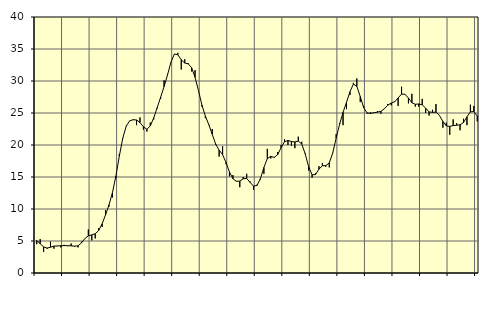
| Category | Piggar | Series 1 |
|---|---|---|
| nan | 4.5 | 5.07 |
| 87.0 | 5.3 | 4.58 |
| 87.0 | 3.3 | 4.08 |
| 87.0 | 3.8 | 3.89 |
| nan | 4.9 | 4.03 |
| 88.0 | 3.8 | 4.2 |
| 88.0 | 4.2 | 4.23 |
| 88.0 | 4 | 4.26 |
| nan | 4.4 | 4.28 |
| 89.0 | 4.2 | 4.27 |
| 89.0 | 4.6 | 4.25 |
| 89.0 | 4.1 | 4.19 |
| nan | 4 | 4.25 |
| 90.0 | 4.9 | 4.7 |
| 90.0 | 5.4 | 5.39 |
| 90.0 | 6.8 | 5.81 |
| nan | 5.1 | 5.95 |
| 91.0 | 5.4 | 6.14 |
| 91.0 | 7 | 6.64 |
| 91.0 | 7.2 | 7.68 |
| nan | 9.8 | 9.09 |
| 92.0 | 10.4 | 10.65 |
| 92.0 | 11.8 | 12.55 |
| 92.0 | 14.8 | 15.14 |
| nan | 18.6 | 18.26 |
| 93.0 | 21 | 21.06 |
| 93.0 | 23 | 22.94 |
| 93.0 | 23.8 | 23.77 |
| nan | 23.9 | 23.95 |
| 94.0 | 23.1 | 23.91 |
| 94.0 | 24.3 | 23.51 |
| 94.0 | 22.4 | 22.84 |
| nan | 22.1 | 22.46 |
| 95.0 | 23.5 | 22.98 |
| 95.0 | 24 | 24.25 |
| 95.0 | 25.7 | 25.82 |
| nan | 27.2 | 27.47 |
| 96.0 | 30.1 | 29.12 |
| 96.0 | 31.1 | 30.95 |
| 96.0 | 32.9 | 32.94 |
| nan | 34.2 | 34.22 |
| 97.0 | 34.4 | 34.1 |
| 97.0 | 31.8 | 33.31 |
| 97.0 | 33.4 | 32.81 |
| nan | 32.8 | 32.68 |
| 98.0 | 31.5 | 32.09 |
| 98.0 | 31.7 | 30.58 |
| 98.0 | 28.5 | 28.5 |
| nan | 26 | 26.23 |
| 99.0 | 24.2 | 24.52 |
| 99.0 | 23.1 | 23.18 |
| 99.0 | 22.5 | 21.67 |
| nan | 20 | 20.13 |
| 0.0 | 18.2 | 19.2 |
| 0.0 | 19.8 | 18.49 |
| 0.0 | 17 | 17.27 |
| nan | 15.1 | 15.78 |
| 1.0 | 15.3 | 14.73 |
| 1.0 | 14.3 | 14.33 |
| 1.0 | 13.4 | 14.36 |
| nan | 15 | 14.72 |
| 2.0 | 15.5 | 14.77 |
| 2.0 | 14.3 | 14.16 |
| 2.0 | 13 | 13.57 |
| nan | 13.8 | 13.69 |
| 3.0 | 14.6 | 14.76 |
| 3.0 | 15.5 | 16.48 |
| 3.0 | 19.4 | 17.88 |
| nan | 17.9 | 18.22 |
| 4.0 | 18 | 18.06 |
| 4.0 | 18.9 | 18.49 |
| 4.0 | 20 | 19.58 |
| nan | 20.9 | 20.52 |
| 5.0 | 20 | 20.71 |
| 5.0 | 19.9 | 20.55 |
| 5.0 | 19.5 | 20.48 |
| nan | 21.3 | 20.6 |
| 6.0 | 20.5 | 20.17 |
| 6.0 | 18.7 | 18.62 |
| 6.0 | 16 | 16.62 |
| nan | 14.9 | 15.34 |
| 7.0 | 15.6 | 15.38 |
| 7.0 | 16.7 | 16.23 |
| 7.0 | 17.2 | 16.75 |
| nan | 16.6 | 16.78 |
| 8.0 | 16.5 | 17.21 |
| 8.0 | 18.7 | 18.74 |
| 8.0 | 21.7 | 21.08 |
| nan | 23.4 | 23.23 |
| 9.0 | 23.1 | 25.1 |
| 9.0 | 25.6 | 26.66 |
| 9.0 | 27.8 | 28.31 |
| nan | 29.7 | 29.5 |
| 10.0 | 30.4 | 29.18 |
| 10.0 | 26.7 | 27.57 |
| 10.0 | 26.1 | 25.83 |
| nan | 24.9 | 25.01 |
| 11.0 | 25.1 | 24.94 |
| 11.0 | 25 | 25.04 |
| 11.0 | 25.3 | 25.13 |
| nan | 24.9 | 25.26 |
| 12.0 | 25.7 | 25.66 |
| 12.0 | 26.4 | 26.22 |
| 12.0 | 26.2 | 26.56 |
| nan | 26.8 | 26.75 |
| 13.0 | 26.1 | 27.36 |
| 13.0 | 29.1 | 27.95 |
| 13.0 | 27.9 | 27.93 |
| nan | 26.5 | 27.33 |
| 14.0 | 28 | 26.6 |
| 14.0 | 26 | 26.36 |
| 14.0 | 26 | 26.41 |
| nan | 27.2 | 26.28 |
| 15.0 | 25 | 25.76 |
| 15.0 | 24.6 | 25.17 |
| 15.0 | 25.5 | 25.1 |
| nan | 26.4 | 25.13 |
| 16.0 | 24.6 | 24.63 |
| 16.0 | 22.7 | 23.69 |
| 16.0 | 23.5 | 22.99 |
| nan | 21.6 | 22.91 |
| 17.0 | 24 | 23.03 |
| 17.0 | 23.4 | 23.09 |
| 17.0 | 22.3 | 23.16 |
| nan | 24.1 | 23.52 |
| 18.0 | 23.1 | 24.4 |
| 18.0 | 26.3 | 25.18 |
| 18.0 | 26.1 | 25.23 |
| nan | 23.7 | 24.51 |